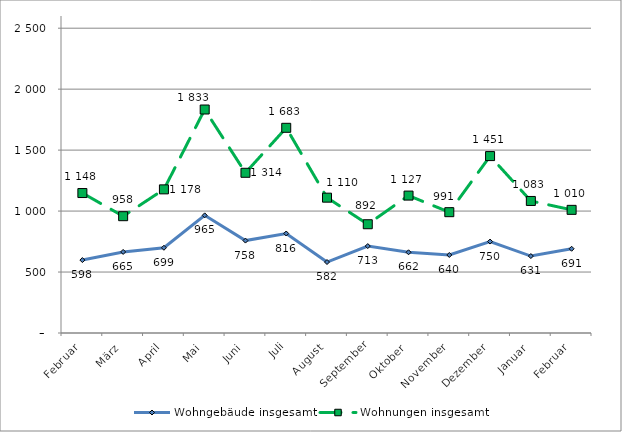
| Category | Wohngebäude insgesamt | Wohnungen insgesamt |
|---|---|---|
| Februar | 598 | 1148 |
| März | 665 | 958 |
| April | 699 | 1178 |
| Mai | 965 | 1833 |
| Juni | 758 | 1314 |
| Juli | 816 | 1683 |
| August | 582 | 1110 |
| September | 713 | 892 |
| Oktober | 662 | 1127 |
| November | 640 | 991 |
| Dezember | 750 | 1451 |
| Januar | 631 | 1083 |
| Februar | 691 | 1010 |